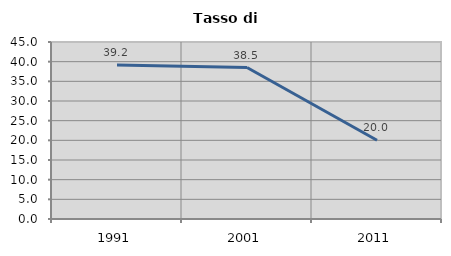
| Category | Tasso di disoccupazione   |
|---|---|
| 1991.0 | 39.176 |
| 2001.0 | 38.504 |
| 2011.0 | 20.019 |